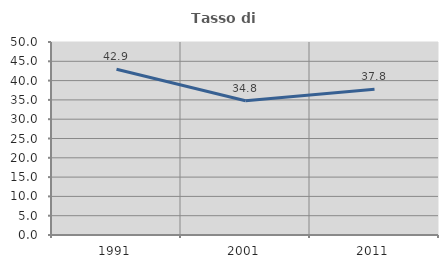
| Category | Tasso di occupazione   |
|---|---|
| 1991.0 | 42.923 |
| 2001.0 | 34.783 |
| 2011.0 | 37.774 |